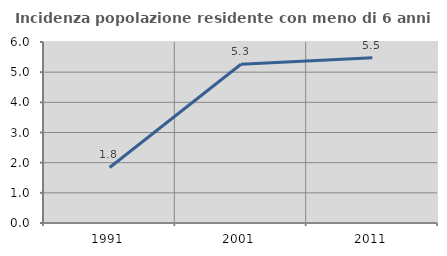
| Category | Incidenza popolazione residente con meno di 6 anni |
|---|---|
| 1991.0 | 1.84 |
| 2001.0 | 5.263 |
| 2011.0 | 5.476 |